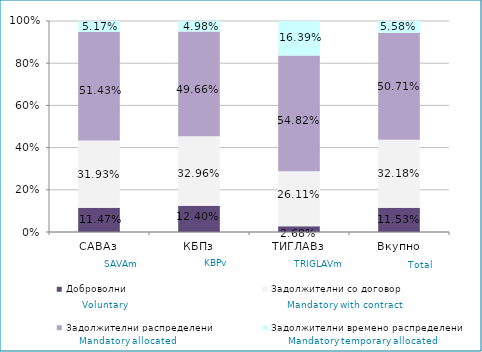
| Category | Доброволни  | Задолжителни со договор  | Задолжителни распределени  | Задолжителни времено распределени  |
|---|---|---|---|---|
| САВАз | 0.115 | 0.319 | 0.514 | 0.052 |
| КБПз | 0.124 | 0.33 | 0.497 | 0.05 |
| ТИГЛАВз | 0.027 | 0.261 | 0.548 | 0.164 |
| Вкупно | 0.115 | 0.322 | 0.507 | 0.056 |